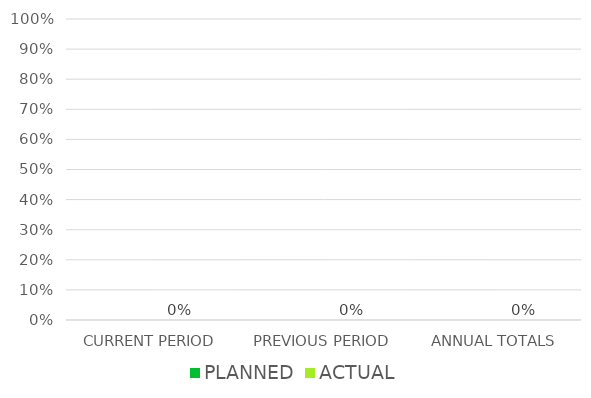
| Category | PLANNED | ACTUAL |
|---|---|---|
| CURRENT PERIOD |  | 0 |
| PREVIOUS PERIOD |  | 0 |
| ANNUAL TOTALS |  | 0 |